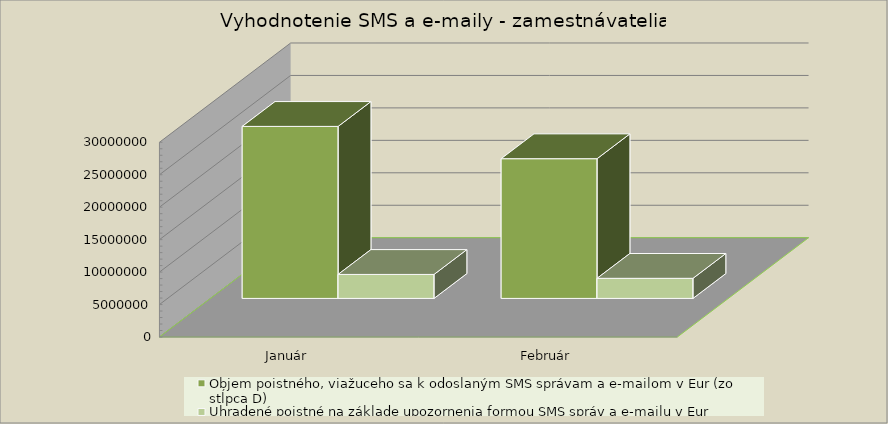
| Category | Objem poistného, viažuceho sa k odoslaným SMS správam a e-mailom v Eur (zo stĺpca D) | Uhradené poistné na základe upozornenia formou SMS správ a e-mailu v Eur |
|---|---|---|
| Január | 26503444.59 | 3694938.77 |
| Február | 21527114.02 | 3094877.08 |